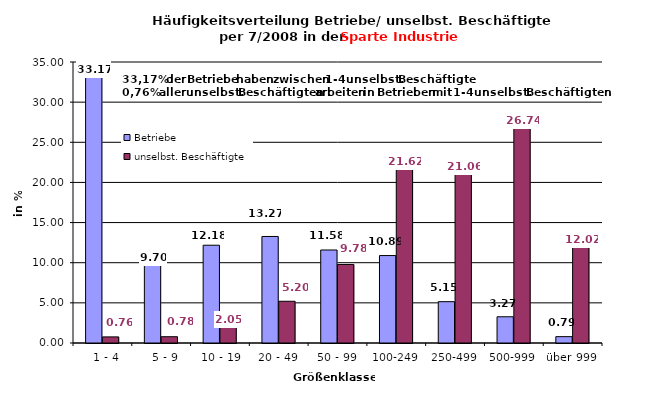
| Category | Betriebe | unselbst. Beschäftigte |
|---|---|---|
|   1 - 4 | 33.168 | 0.76 |
|   5 - 9 | 9.703 | 0.782 |
|  10 - 19 | 12.178 | 2.046 |
| 20 - 49 | 13.267 | 5.198 |
| 50 - 99 | 11.584 | 9.782 |
| 100-249 | 10.891 | 21.618 |
| 250-499 | 5.149 | 21.057 |
| 500-999 | 3.267 | 26.736 |
| über 999 | 0.792 | 12.019 |